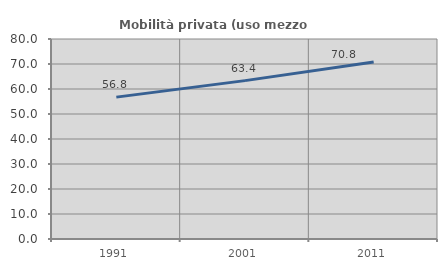
| Category | Mobilità privata (uso mezzo privato) |
|---|---|
| 1991.0 | 56.753 |
| 2001.0 | 63.353 |
| 2011.0 | 70.81 |